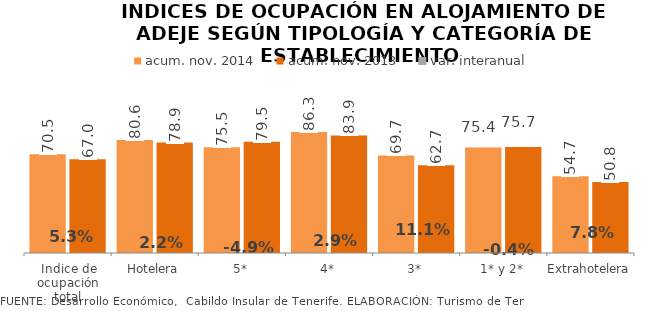
| Category | acum. nov. 2014 | acum. nov. 2013 |
|---|---|---|
| Indice de ocupación total | 70.531 | 66.968 |
| Hotelera | 80.646 | 78.918 |
| 5* | 75.539 | 79.451 |
| 4* | 86.35 | 83.949 |
| 3* | 69.712 | 62.745 |
| 1* y 2* | 75.354 | 75.686 |
| Extrahotelera | 54.743 | 50.768 |